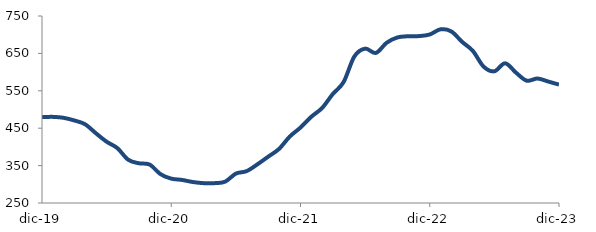
| Category | Series 0 |
|---|---|
| 2019-12-01 | 479.593 |
| 2020-01-01 | 480.293 |
| 2020-02-01 | 477.774 |
| 2020-03-01 | 470.708 |
| 2020-04-01 | 460.537 |
| 2020-05-01 | 436.562 |
| 2020-06-01 | 413.857 |
| 2020-07-01 | 396.652 |
| 2020-08-01 | 365.687 |
| 2020-09-01 | 356.18 |
| 2020-10-01 | 352.658 |
| 2020-11-01 | 327.164 |
| 2020-12-01 | 315.173 |
| 2021-01-01 | 311.708 |
| 2021-02-01 | 306.103 |
| 2021-03-01 | 303.075 |
| 2021-04-01 | 303.034 |
| 2021-05-01 | 306.996 |
| 2021-06-01 | 328.614 |
| 2021-07-01 | 335.232 |
| 2021-08-01 | 353.414 |
| 2021-09-01 | 373.869 |
| 2021-10-01 | 394.393 |
| 2021-11-01 | 427.592 |
| 2021-12-01 | 451.83 |
| 2022-01-01 | 480.528 |
| 2022-02-01 | 503.882 |
| 2022-03-01 | 541.428 |
| 2022-04-01 | 573.261 |
| 2022-05-01 | 641.774 |
| 2022-06-01 | 662.728 |
| 2022-07-01 | 651.267 |
| 2022-08-01 | 678.506 |
| 2022-09-01 | 692.688 |
| 2022-10-01 | 695.873 |
| 2022-11-01 | 696.235 |
| 2022-12-01 | 700.598 |
| 2023-01-01 | 714.422 |
| 2023-02-01 | 708.75 |
| 2023-03-01 | 680.994 |
| 2023-04-01 | 656.708 |
| 2023-05-01 | 614.698 |
| 2023-06-01 | 602.139 |
| 2023-07-01 | 623.52 |
| 2023-08-01 | 598.686 |
| 2023-09-01 | 577.1 |
| 2023-10-01 | 582.836 |
| 2023-11-01 | 574.767 |
| 2023-12-01 | 566.559 |